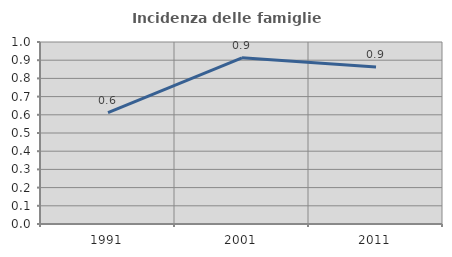
| Category | Incidenza delle famiglie numerose |
|---|---|
| 1991.0 | 0.611 |
| 2001.0 | 0.913 |
| 2011.0 | 0.862 |